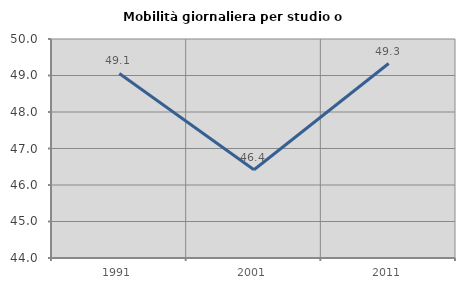
| Category | Mobilità giornaliera per studio o lavoro |
|---|---|
| 1991.0 | 49.057 |
| 2001.0 | 46.416 |
| 2011.0 | 49.327 |